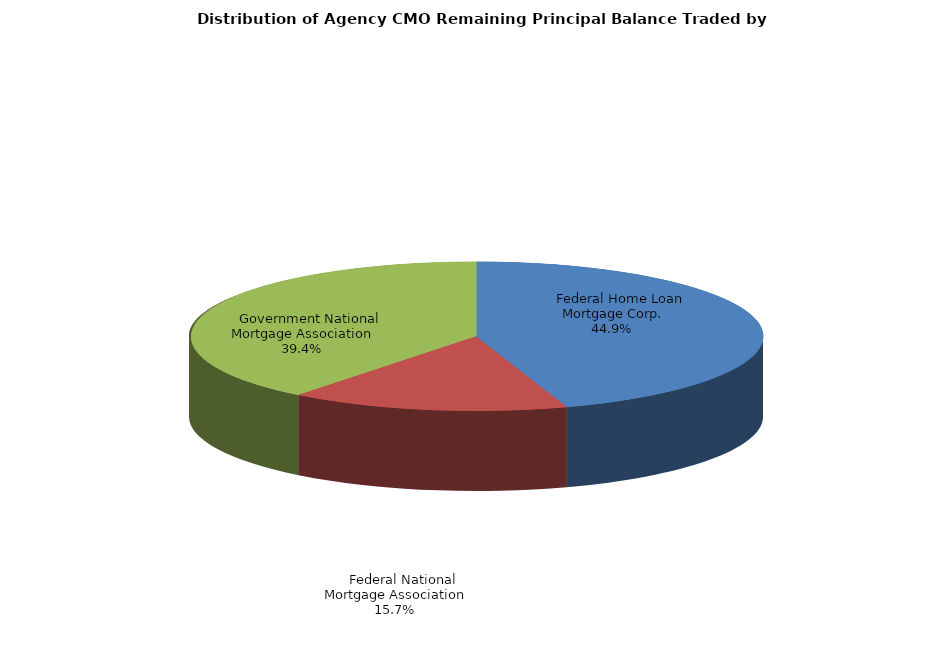
| Category | Series 0 |
|---|---|
|     Federal Home Loan Mortgage Corp. | 2533276873.358 |
|     Federal National Mortgage Association | 886095903.612 |
|     Government National Mortgage Association | 2223311632.537 |